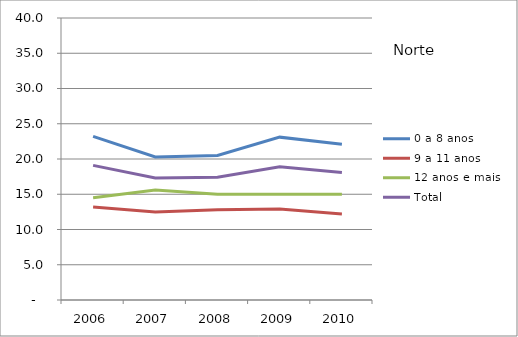
| Category | 0 a 8 anos | 9 a 11 anos | 12 anos e mais | Total |
|---|---|---|---|---|
| 2006.0 | 23.2 | 13.2 | 14.5 | 19.1 |
| 2007.0 | 20.3 | 12.5 | 15.6 | 17.3 |
| 2008.0 | 20.5 | 12.8 | 15 | 17.4 |
| 2009.0 | 23.1 | 12.9 | 15 | 18.9 |
| 2010.0 | 22.1 | 12.2 | 15 | 18.1 |